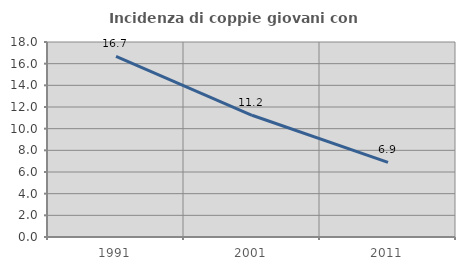
| Category | Incidenza di coppie giovani con figli |
|---|---|
| 1991.0 | 16.673 |
| 2001.0 | 11.237 |
| 2011.0 | 6.884 |